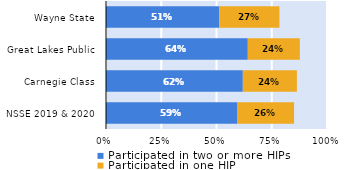
| Category | Participated in two or more HIPs | Participated in one HIP |
|---|---|---|
| NSSE 2019 & 2020 | 0.595 | 0.256 |
| Carnegie Class | 0.619 | 0.245 |
| Great Lakes Public | 0.642 | 0.236 |
| Wayne State | 0.512 | 0.272 |